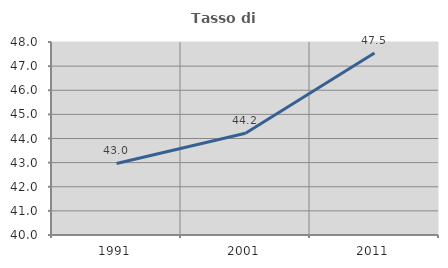
| Category | Tasso di occupazione   |
|---|---|
| 1991.0 | 42.966 |
| 2001.0 | 44.217 |
| 2011.0 | 47.547 |